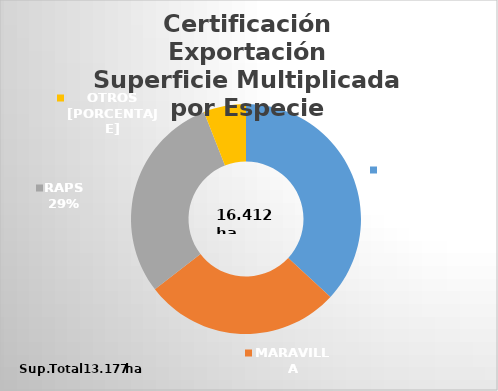
| Category | Series 0 |
|---|---|
| MAÍZ | 4859.459 |
| MARAVILLA | 3645.994 |
| RAPS | 3886.552 |
| OTROS (Arveja, Avena, Avena Estrigosa, Cebada, Haba, Lino, Lupino Blanco, Mostaza Blanca, Mostaza Parda, Soya, Tabaco, Trébol Encarnado, Trébol Rosado) | 784.8 |